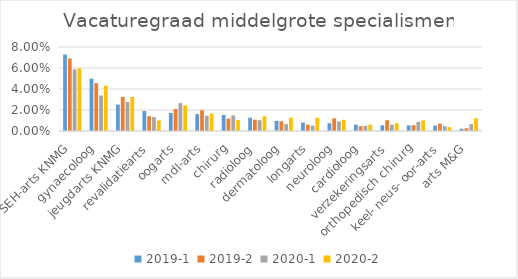
| Category | 2019-1 | 2019-2 | 2020-1 | 2020-2 |
|---|---|---|---|---|
| SEH-arts KNMG | 0.073 | 0.069 | 0.059 | 0.06 |
| gynaecoloog | 0.05 | 0.046 | 0.034 | 0.043 |
| jeugdarts KNMG | 0.025 | 0.032 | 0.028 | 0.032 |
| revalidatiearts | 0.019 | 0.014 | 0.013 | 0.01 |
| oogarts | 0.017 | 0.021 | 0.027 | 0.024 |
| mdl-arts | 0.016 | 0.02 | 0.015 | 0.017 |
| chirurg | 0.015 | 0.012 | 0.015 | 0.01 |
| radioloog | 0.013 | 0.011 | 0.01 | 0.014 |
| dermatoloog | 0.01 | 0.009 | 0.007 | 0.013 |
| longarts | 0.008 | 0.006 | 0.005 | 0.013 |
| neuroloog | 0.007 | 0.012 | 0.009 | 0.011 |
| cardioloog | 0.006 | 0.005 | 0.005 | 0.006 |
| verzekeringsarts | 0.005 | 0.01 | 0.006 | 0.007 |
| orthopedisch chirurg | 0.005 | 0.006 | 0.009 | 0.01 |
| keel- neus- oor-arts | 0.005 | 0.007 | 0.005 | 0.004 |
| arts M&G | 0.002 | 0.003 | 0.007 | 0.012 |